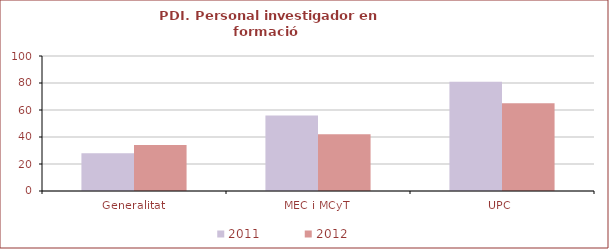
| Category | 2011 | 2012 |
|---|---|---|
| Generalitat | 28 | 34 |
| MEC i MCyT | 56 | 42 |
| UPC  | 81 | 65 |